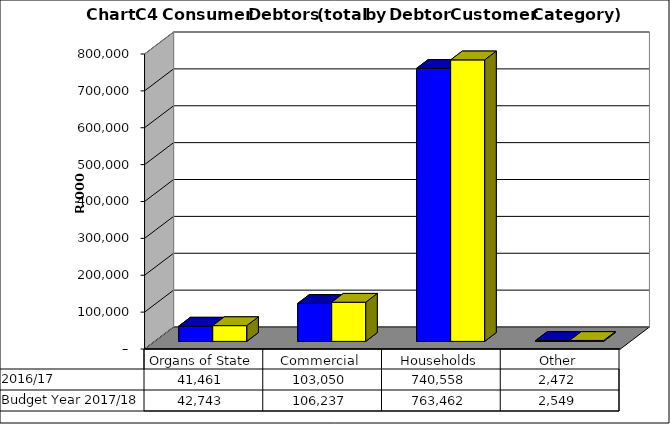
| Category |  2016/17  | Budget Year 2017/18 |
|---|---|---|
| Organs of State | 41460710.728 | 42743000.75 |
| Commercial | 103049998.504 | 106237111.86 |
| Households | 740558068.55 | 763461926.34 |
| Other | 2472242.909 | 2548704.03 |